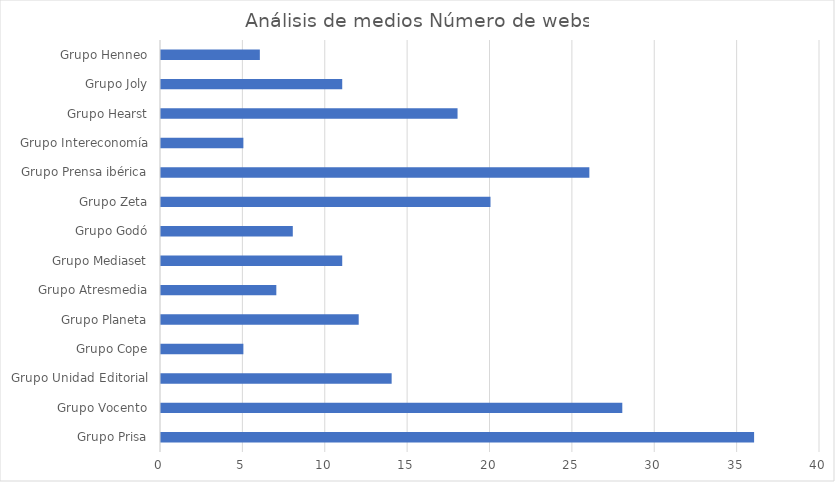
| Category | Análisis de medios |
|---|---|
| Grupo Prisa | 36 |
| Grupo Vocento | 28 |
| Grupo Unidad Editorial | 14 |
| Grupo Cope | 5 |
| Grupo Planeta | 12 |
| Grupo Atresmedia | 7 |
| Grupo Mediaset | 11 |
| Grupo Godó | 8 |
| Grupo Zeta | 20 |
| Grupo Prensa ibérica | 26 |
| Grupo Intereconomía | 5 |
| Grupo Hearst | 18 |
| Grupo Joly | 11 |
| Grupo Henneo | 6 |